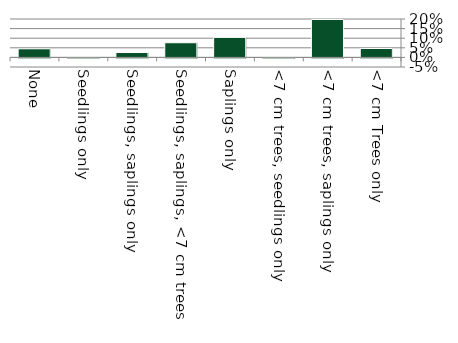
| Category | Native |
|---|---|
| None | 0.045 |
| Seedlings only | 0 |
| Seedlings, saplings only | 0.025 |
| Seedlings, saplings, <7 cm trees | 0.076 |
| Saplings only | 0.104 |
| <7 cm trees, seedlings only | 0 |
| <7 cm trees, saplings only | 0.197 |
| <7 cm Trees only | 0.046 |